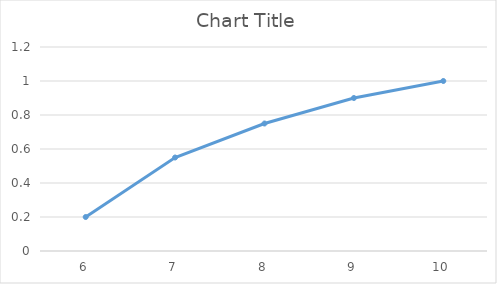
| Category | Series 0 |
|---|---|
| 6.0 | 0.2 |
| 7.0 | 0.55 |
| 8.0 | 0.75 |
| 9.0 | 0.9 |
| 10.0 | 1 |